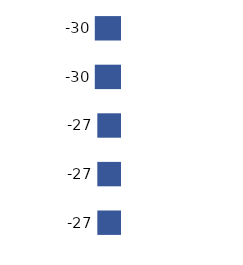
| Category | Series 0 |
|---|---|
| 0 | -30 |
| 1 | -30 |
| 2 | -27 |
| 3 | -27 |
| 4 | -27 |